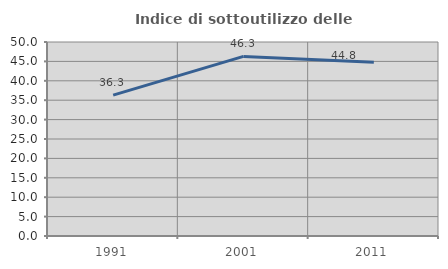
| Category | Indice di sottoutilizzo delle abitazioni  |
|---|---|
| 1991.0 | 36.317 |
| 2001.0 | 46.293 |
| 2011.0 | 44.799 |